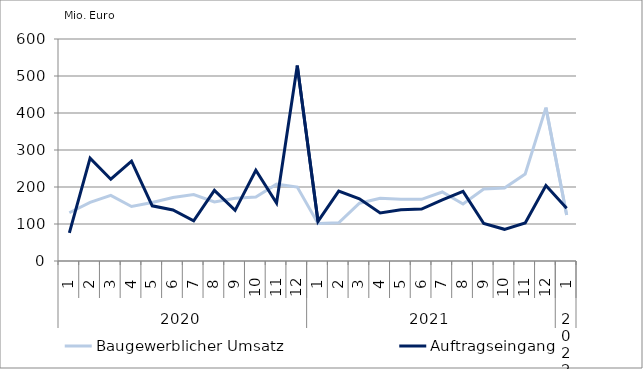
| Category | Baugewerblicher Umsatz | Auftragseingang |
|---|---|---|
| 0 | 130445.562 | 75891.481 |
| 1 | 158433.655 | 277923.85 |
| 2 | 177529.832 | 220973.626 |
| 3 | 147259.799 | 269936.091 |
| 4 | 157965.891 | 149072.895 |
| 5 | 171647.778 | 137984.76 |
| 6 | 179530.732 | 108645.965 |
| 7 | 159480.457 | 190771.468 |
| 8 | 169638.111 | 136988.906 |
| 9 | 173040.053 | 245341.603 |
| 10 | 207619.085 | 156647.224 |
| 11 | 199947.086 | 528166.004 |
| 12 | 101295.895 | 106850.127 |
| 13 | 103236.543 | 188883.434 |
| 14 | 156172.725 | 168204.42 |
| 15 | 169257.088 | 130052.073 |
| 16 | 166897.821 | 138492.214 |
| 17 | 166720.216 | 140262.426 |
| 18 | 186515.191 | 165331.191 |
| 19 | 154188.941 | 188169.655 |
| 20 | 194464.12 | 101359.538 |
| 21 | 197281.201 | 85626.862 |
| 22 | 235325.083 | 102880.924 |
| 23 | 414469.471 | 203900.676 |
| 24 | 124217.549 | 142351.759 |